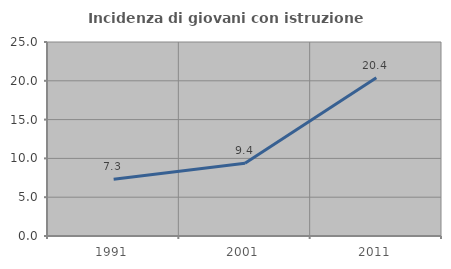
| Category | Incidenza di giovani con istruzione universitaria |
|---|---|
| 1991.0 | 7.306 |
| 2001.0 | 9.369 |
| 2011.0 | 20.404 |